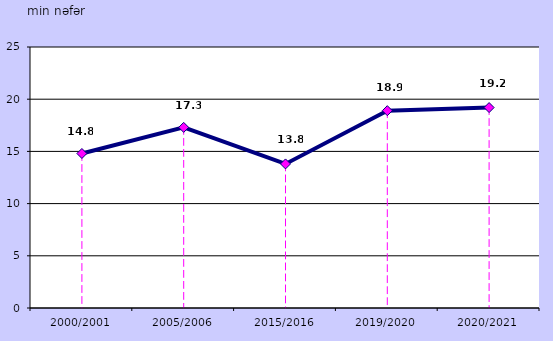
| Category | Series 0 |
|---|---|
| 2000/2001 | 14.8 |
| 2005/2006 | 17.3 |
| 2015/2016 | 13.8 |
| 2019/2020 | 18.9 |
| 2020/2021 | 19.2 |